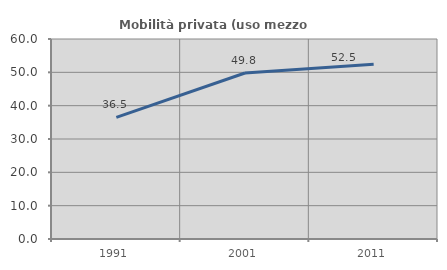
| Category | Mobilità privata (uso mezzo privato) |
|---|---|
| 1991.0 | 36.501 |
| 2001.0 | 49.802 |
| 2011.0 | 52.461 |